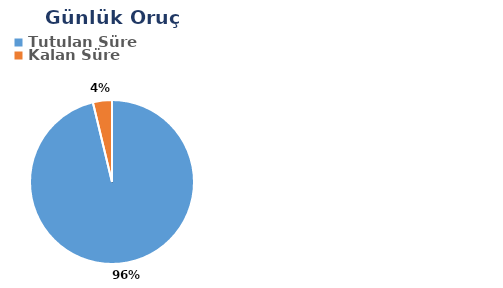
| Category | Günlük |
|---|---|
| Tutulan Süre | 0.572 |
| Kalan Süre | 0.022 |